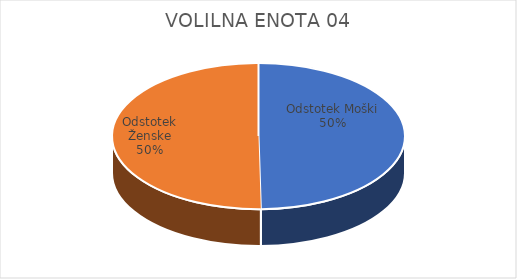
| Category | VOLILNA ENOTA 04 | #REF! | Slovenija skupaj |
|---|---|---|---|
| Odstotek Moški | 7.82 |  | 7.6 |
| Odstotek Ženske | 7.9 |  | 7.35 |